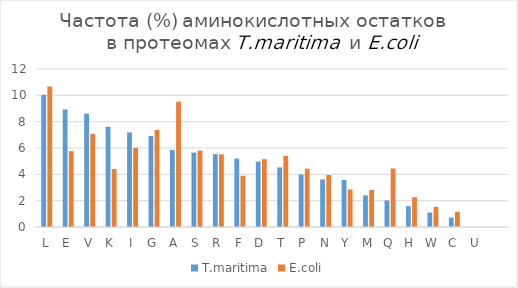
| Category | T.maritima | E.coli |
|---|---|---|
| L | 10.039 | 10.673 |
| E | 8.925 | 5.763 |
| V | 8.61 | 7.073 |
| K | 7.617 | 4.406 |
| I | 7.185 | 6.01 |
| G | 6.908 | 7.375 |
| A | 5.849 | 9.515 |
| S | 5.651 | 5.802 |
| R | 5.536 | 5.511 |
| F | 5.195 | 3.89 |
| D | 4.966 | 5.151 |
| T | 4.526 | 5.399 |
| P | 3.993 | 4.425 |
| N | 3.61 | 3.945 |
| Y | 3.58 | 2.845 |
| M | 2.403 | 2.819 |
| Q | 2.013 | 4.44 |
| H | 1.585 | 2.266 |
| W | 1.102 | 1.531 |
| C | 0.708 | 1.158 |
| U | 0 | 0 |